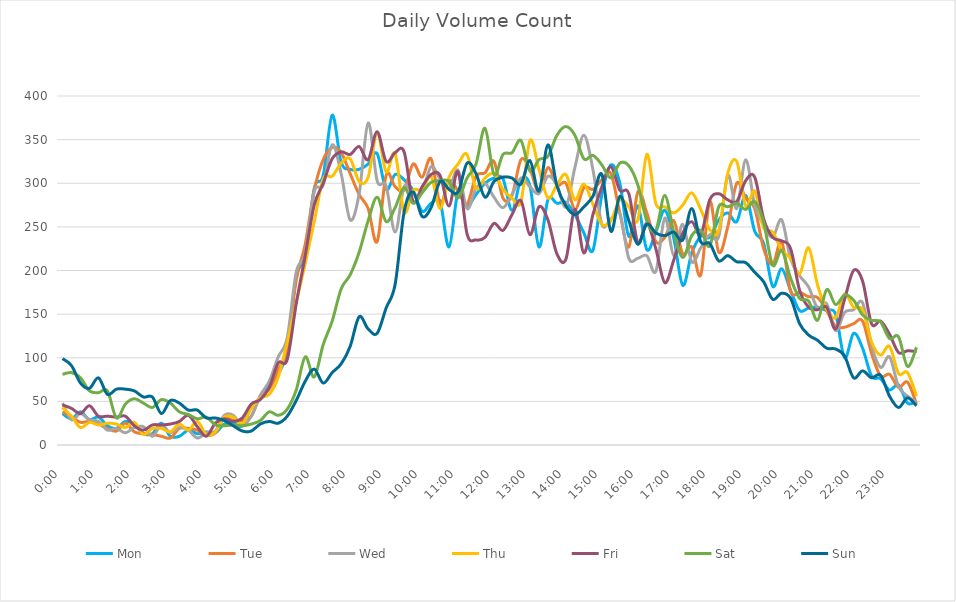
| Category | Mon | Tue | Wed | Thu | Fri | Sat | Sun |
|---|---|---|---|---|---|---|---|
| 0.0 | 36 | 38 | 48 | 43 | 46 | 81 | 99 |
| 0.010416666666666666 | 30 | 32 | 29 | 33 | 42 | 83 | 91 |
| 0.020833333333333332 | 38 | 26 | 36 | 20 | 36 | 77 | 71 |
| 0.03125 | 29 | 27 | 29 | 26 | 45 | 62 | 65 |
| 0.041666666666666664 | 32 | 24 | 27 | 23 | 33 | 60 | 77 |
| 0.05208333333333333 | 22 | 19 | 17 | 25 | 33 | 62 | 58 |
| 0.06249999999999999 | 19 | 16 | 19 | 24 | 32 | 31 | 64 |
| 0.07291666666666666 | 27 | 25 | 14 | 20 | 33 | 47 | 64 |
| 0.08333333333333333 | 23 | 15 | 20 | 26 | 22 | 53 | 62 |
| 0.09375 | 13 | 13 | 21 | 12 | 17 | 48 | 55 |
| 0.10416666666666667 | 13 | 12 | 10 | 19 | 23 | 43 | 55 |
| 0.11458333333333334 | 25 | 10 | 23 | 19 | 23 | 52 | 36 |
| 0.125 | 10 | 8 | 14 | 15 | 24 | 48 | 51 |
| 0.13541666666666666 | 10 | 19 | 20 | 24 | 27 | 38 | 48 |
| 0.14583333333333331 | 17 | 19 | 17 | 17 | 34 | 35 | 40 |
| 0.15624999999999997 | 13 | 17 | 8 | 27 | 21 | 30 | 40 |
| 0.16666666666666663 | 15 | 11 | 14 | 12 | 10 | 32 | 31 |
| 0.1770833333333333 | 14 | 14 | 16 | 15 | 25 | 23 | 31 |
| 0.18749999999999994 | 24 | 31 | 34 | 32 | 30 | 22 | 28 |
| 0.1979166666666666 | 25 | 28 | 34 | 32 | 27 | 23 | 22 |
| 0.20833333333333326 | 22 | 28 | 22 | 24 | 31 | 22 | 16 |
| 0.21874999999999992 | 45 | 33 | 33 | 42 | 47 | 24 | 16 |
| 0.22916666666666657 | 53 | 56 | 57 | 54 | 52 | 28 | 24 |
| 0.23958333333333323 | 69 | 64 | 73 | 58 | 66 | 38 | 27 |
| 0.2499999999999999 | 81 | 86 | 101 | 78 | 94 | 34 | 25 |
| 0.2604166666666666 | 110 | 111 | 123 | 118 | 98 | 41 | 33 |
| 0.27083333333333326 | 193 | 189 | 198 | 163 | 162 | 63 | 51 |
| 0.28124999999999994 | 216 | 230 | 220 | 208 | 217 | 101 | 73 |
| 0.29166666666666663 | 294 | 292 | 290 | 256 | 275 | 78 | 87 |
| 0.3020833333333333 | 309 | 327 | 298 | 305 | 300 | 115 | 71 |
| 0.3125 | 378 | 341 | 344 | 308 | 328 | 142 | 83 |
| 0.3229166666666667 | 324 | 335 | 311 | 323 | 336 | 179 | 93 |
| 0.33333333333333337 | 316 | 311 | 258 | 328 | 333 | 195 | 113 |
| 0.34375000000000006 | 316 | 287 | 288 | 302 | 342 | 221 | 147 |
| 0.35416666666666674 | 322 | 271 | 369 | 307 | 327 | 257 | 133 |
| 0.3645833333333334 | 334 | 233 | 303 | 358 | 359 | 284 | 128 |
| 0.3750000000000001 | 293 | 309 | 297 | 313 | 325 | 256 | 157 |
| 0.3854166666666668 | 310 | 296 | 244 | 334 | 335 | 272 | 184 |
| 0.3958333333333335 | 304 | 292 | 296 | 267 | 336 | 295 | 267 |
| 0.40625000000000017 | 292 | 322 | 287 | 292 | 279 | 277 | 290 |
| 0.41666666666666685 | 268 | 307 | 290 | 292 | 296 | 289 | 262 |
| 0.4270833333333333 | 277 | 328 | 319 | 308 | 310 | 301 | 272 |
| 0.4375000000000002 | 279 | 277 | 305 | 271 | 309 | 303 | 302 |
| 0.4479166666666669 | 227 | 303 | 294 | 307 | 274 | 302 | 293 |
| 0.4583333333333333 | 290 | 291 | 315 | 322 | 313 | 283 | 290 |
| 0.4687500000000003 | 274 | 276 | 271 | 333 | 242 | 306 | 323 |
| 0.47916666666666696 | 287 | 308 | 294 | 294 | 235 | 322 | 311 |
| 0.4895833333333333 | 300 | 312 | 300 | 306 | 238 | 363 | 284 |
| 0.5000000000000003 | 306 | 325 | 284 | 311 | 254 | 310 | 302 |
| 0.510416666666667 | 305 | 283 | 272 | 293 | 246 | 333 | 307 |
| 0.5208333333333334 | 269 | 286 | 287 | 283 | 264 | 335 | 306 |
| 0.5312500000000002 | 304 | 327 | 306 | 279 | 280 | 349 | 299 |
| 0.5416666666666669 | 297 | 316 | 296 | 349 | 241 | 314 | 326 |
| 0.5520833333333335 | 227 | 290 | 288 | 316 | 273 | 327 | 291 |
| 0.5625000000000001 | 281 | 318 | 308 | 283 | 258 | 331 | 344 |
| 0.5729166666666667 | 277 | 298 | 298 | 298 | 219 | 355 | 297 |
| 0.5833333333333334 | 278 | 300 | 273 | 310 | 213 | 365 | 274 |
| 0.59375 | 264 | 270 | 318 | 281 | 270 | 355 | 264 |
| 0.6041666666666666 | 243 | 295 | 355 | 299 | 220 | 328 | 273 |
| 0.6145833333333333 | 223 | 293 | 316 | 276 | 264 | 332 | 285 |
| 0.6249999999999999 | 287 | 304 | 253 | 253 | 296 | 321 | 310 |
| 0.6354166666666665 | 321 | 311 | 259 | 257 | 319 | 306 | 245 |
| 0.6458333333333331 | 300 | 266 | 265 | 281 | 292 | 323 | 285 |
| 0.6562499999999998 | 239 | 227 | 214 | 273 | 288 | 320 | 257 |
| 0.6666666666666666 | 274 | 290 | 214 | 258 | 232 | 298 | 230 |
| 0.677083333333333 | 224 | 266 | 217 | 333 | 254 | 257 | 253 |
| 0.6874999999999997 | 244 | 233 | 199 | 277 | 225 | 246 | 243 |
| 0.6979166666666666 | 269 | 238 | 260 | 273 | 186 | 286 | 240 |
| 0.7083333333333329 | 237 | 257 | 217 | 266 | 212 | 244 | 244 |
| 0.7187499999999996 | 183 | 219 | 253 | 275 | 243 | 215 | 235 |
| 0.7291666666666666 | 220 | 227 | 210 | 289 | 256 | 240 | 271 |
| 0.7395833333333328 | 239 | 195 | 226 | 270 | 241 | 246 | 233 |
| 0.75 | 238 | 279 | 241 | 247 | 281 | 228 | 231 |
| 0.7604166666666666 | 258 | 221 | 239 | 246 | 288 | 273 | 211 |
| 0.7708333333333327 | 266 | 250 | 309 | 311 | 281 | 273 | 217 |
| 0.78125 | 256 | 300 | 271 | 325 | 279 | 277 | 210 |
| 0.7916666666666666 | 286 | 283 | 327 | 274 | 303 | 270 | 209 |
| 0.8020833333333326 | 245 | 271 | 275 | 291 | 307 | 279 | 198 |
| 0.8125 | 231 | 225 | 252 | 249 | 259 | 255 | 187 |
| 0.8229166666666666 | 182 | 207 | 238 | 244 | 238 | 206 | 167 |
| 0.8333333333333334 | 202 | 233 | 258 | 223 | 234 | 223 | 174 |
| 0.84375 | 177 | 176 | 213 | 214 | 225 | 191 | 168 |
| 0.8541666666666666 | 154 | 175 | 194 | 196 | 177 | 168 | 139 |
| 0.8645833333333334 | 157 | 170 | 181 | 226 | 158 | 165 | 126 |
| 0.875 | 158 | 169 | 157 | 183 | 155 | 143 | 120 |
| 0.8854166666666666 | 154 | 154 | 162 | 156 | 158 | 178 | 111 |
| 0.8958333333333334 | 150 | 136 | 131 | 146 | 133 | 161 | 110 |
| 0.90625 | 100 | 135 | 152 | 173 | 167 | 172 | 102 |
| 0.9166666666666666 | 128 | 139 | 155 | 158 | 200 | 166 | 77 |
| 0.9270833333333334 | 111 | 142 | 163 | 155 | 188 | 149 | 85 |
| 0.9375 | 79 | 105 | 114 | 118 | 139 | 143 | 77 |
| 0.9479166666666666 | 76 | 79 | 89 | 103 | 142 | 141 | 80 |
| 0.9583333333333334 | 63 | 81 | 101 | 113 | 127 | 122 | 56 |
| 0.96875 | 69 | 66 | 67 | 82 | 106 | 124 | 43 |
| 0.9791666666666666 | 48 | 72 | 56 | 83 | 108 | 90 | 54 |
| 0.9895833333333334 | 50 | 47 | 49 | 56 | 107 | 112 | 45 |